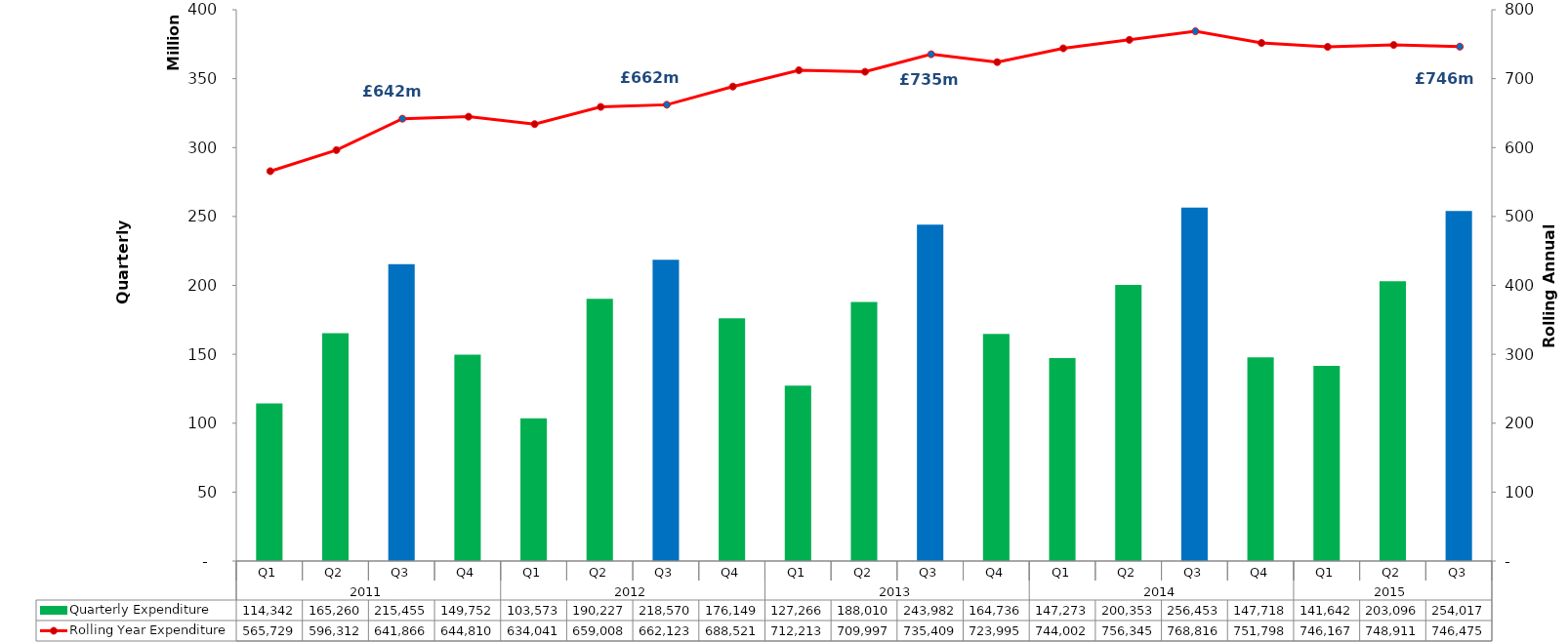
| Category | Quarterly Expenditure  |
|---|---|
| 0 | 114342273.997 |
| 1 | 165260743.695 |
| 2 | 215455609.895 |
| 3 | 149752192.495 |
| 4 | 103573377.742 |
| 5 | 190227338.92 |
| 6 | 218570670.387 |
| 7 | 176149778.783 |
| 8 | 127266084.708 |
| 9 | 188010488.077 |
| 10 | 243982693.262 |
| 11 | 164736243.465 |
| 12 | 147273201.696 |
| 13 | 200353363.63 |
| 14 | 256453194.841 |
| 15 | 147718680.072 |
| 16 | 141642593.113 |
| 17 | 203096925.436 |
| 18 | 254017140.735 |